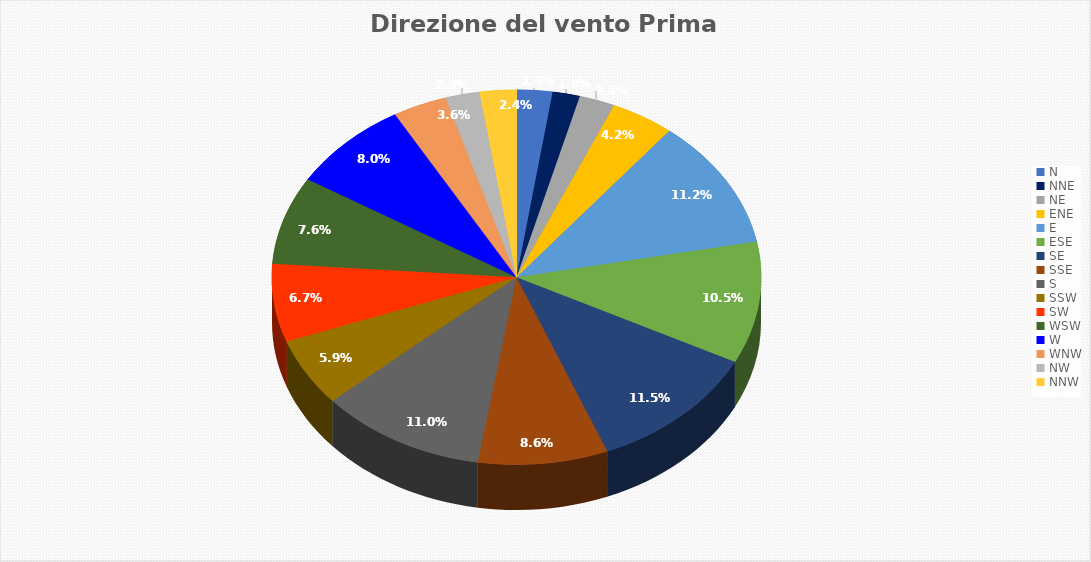
| Category | Percentuale |
|---|---|
| N | 2.361 |
| NNE | 1.806 |
| NE | 2.361 |
| ENE | 4.201 |
| E | 11.215 |
| ESE | 10.521 |
| SE | 11.493 |
| SSE | 8.576 |
| S | 11.007 |
| SSW | 5.868 |
| SW | 6.736 |
| WSW | 7.604 |
| W | 7.986 |
| WNW | 3.576 |
| NW | 2.257 |
| NNW | 2.431 |